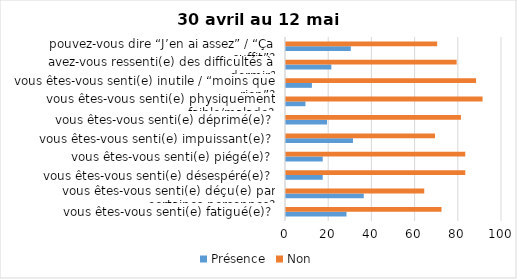
| Category | Présence | Non |
|---|---|---|
| vous êtes-vous senti(e) fatigué(e)? | 28 | 72 |
| vous êtes-vous senti(e) déçu(e) par certaines personnes? | 36 | 64 |
| vous êtes-vous senti(e) désespéré(e)? | 17 | 83 |
| vous êtes-vous senti(e) piégé(e)? | 17 | 83 |
| vous êtes-vous senti(e) impuissant(e)? | 31 | 69 |
| vous êtes-vous senti(e) déprimé(e)? | 19 | 81 |
| vous êtes-vous senti(e) physiquement faible/malade? | 9 | 91 |
| vous êtes-vous senti(e) inutile / “moins que rien”? | 12 | 88 |
| avez-vous ressenti(e) des difficultés à dormir? | 21 | 79 |
| pouvez-vous dire “J’en ai assez” / “Ça suffit”? | 30 | 70 |